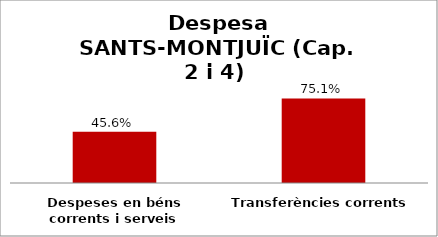
| Category | Series 0 |
|---|---|
| Despeses en béns corrents i serveis | 0.456 |
| Transferències corrents | 0.751 |